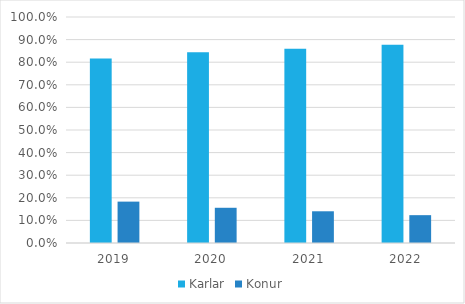
| Category | Karlar | Konur |
|---|---|---|
| 2019.0 | 0.817 | 0.183 |
| 2020.0 | 0.844 | 0.156 |
| 2021.0 | 0.86 | 0.14 |
| 2022.0 | 0.877 | 0.123 |